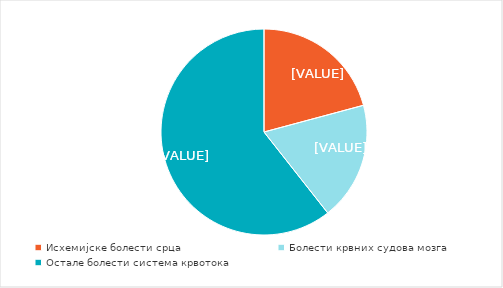
| Category | Series 0 |
|---|---|
| Исхемијске болести срца  | 20.823 |
| Болести крвних судова мозга  | 18.561 |
| Остале болести система крвотока  | 60.616 |